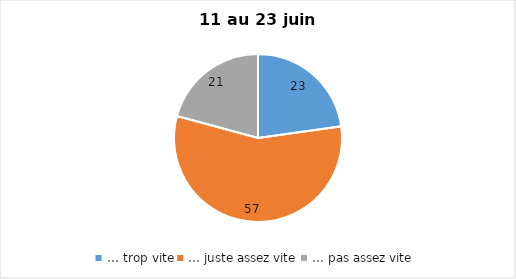
| Category | Series 0 |
|---|---|
| … trop vite | 23 |
| … juste assez vite | 57 |
| … pas assez vite | 21 |